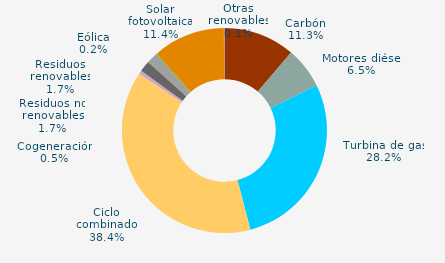
| Category | Series 0 |
|---|---|
| Carbón | 11.261 |
| Motores diésel | 6.508 |
| Turbina de gas | 28.158 |
| Ciclo combinado | 38.42 |
| Generación auxiliar | 0 |
| Cogeneración | 0.538 |
| Residuos no renovables | 1.746 |
| Residuos renovables | 1.746 |
| Eólica | 0.167 |
| Solar fotovoltaica | 11.356 |
| Otras renovables | 0.099 |